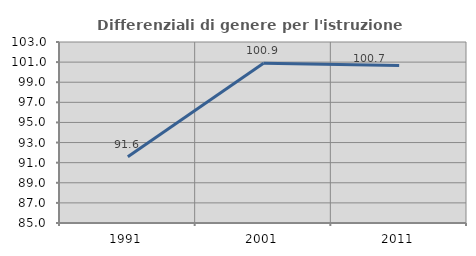
| Category | Differenziali di genere per l'istruzione superiore |
|---|---|
| 1991.0 | 91.58 |
| 2001.0 | 100.896 |
| 2011.0 | 100.664 |